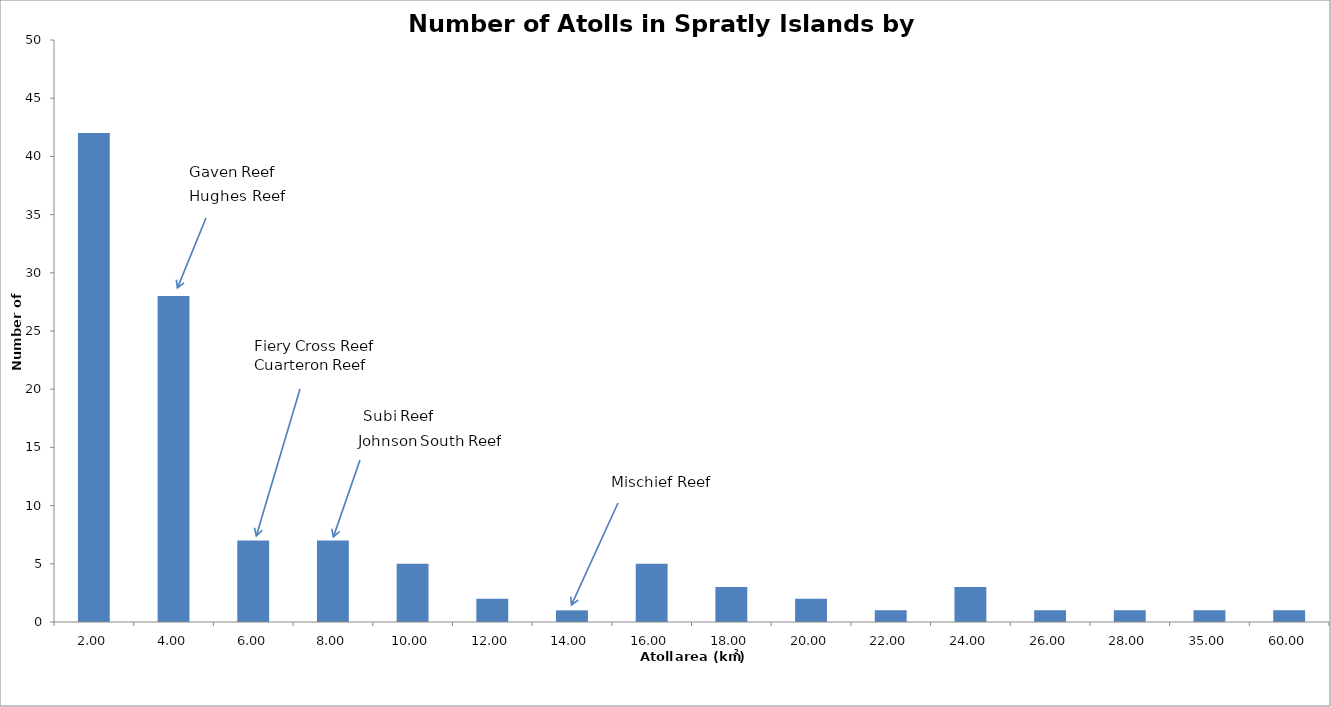
| Category | Area |
|---|---|
| 2.0 | 42 |
| 4.0 | 28 |
| 6.0 | 7 |
| 8.0 | 7 |
| 10.0 | 5 |
| 12.0 | 2 |
| 14.0 | 1 |
| 16.0 | 5 |
| 18.0 | 3 |
| 20.0 | 2 |
| 22.0 | 1 |
| 24.0 | 3 |
| 26.0 | 1 |
| 28.0 | 1 |
| 35.0 | 1 |
| 60.0 | 1 |